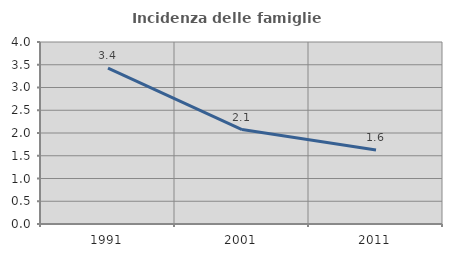
| Category | Incidenza delle famiglie numerose |
|---|---|
| 1991.0 | 3.425 |
| 2001.0 | 2.075 |
| 2011.0 | 1.625 |